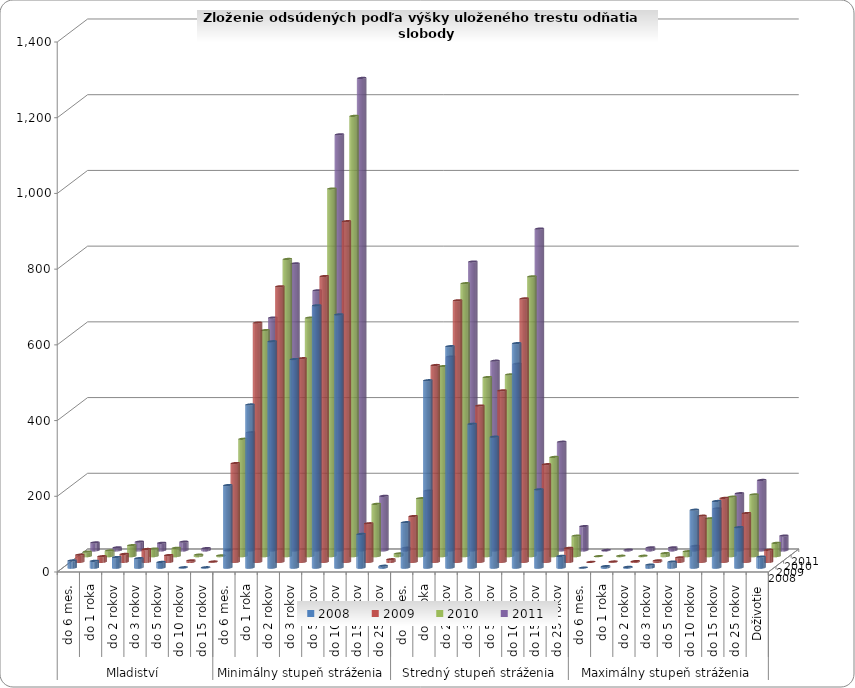
| Category | 2008 | 2009 | 2010 | 2011 |
|---|---|---|---|---|
| 0 | 19 | 19 | 12 | 21 |
| 1 | 18 | 15 | 15 | 8 |
| 2 | 28 | 21 | 29 | 23 |
| 3 | 25 | 34 | 20 | 20 |
| 4 | 15 | 18 | 22 | 23 |
| 5 | 1 | 4 | 4 | 6 |
| 6 | 1 | 1 | 2 | 1 |
| 7 | 218 | 261 | 310 | 312 |
| 8 | 431 | 632 | 597 | 615 |
| 9 | 598 | 728 | 785 | 758 |
| 10 | 551 | 538 | 630 | 687 |
| 11 | 693 | 755 | 971 | 1099 |
| 12 | 669 | 900 | 1163 | 1248 |
| 13 | 89 | 102 | 138 | 144 |
| 14 | 5 | 7 | 7 | 7 |
| 15 | 120 | 121 | 153 | 158 |
| 16 | 495 | 520 | 502 | 512 |
| 17 | 585 | 691 | 721 | 763 |
| 18 | 380 | 413 | 473 | 501 |
| 19 | 346 | 453 | 480 | 493 |
| 20 | 593 | 696 | 739 | 850 |
| 21 | 207 | 258 | 262 | 287 |
| 22 | 31 | 37 | 54 | 64 |
| 23 | 0 | 0 | 0 | 1 |
| 24 | 4 | 1 | 1 | 2 |
| 25 | 2 | 2 | 1 | 8 |
| 26 | 8 | 4 | 8 | 8 |
| 27 | 16 | 12 | 13 | 12 |
| 28 | 153 | 122 | 100 | 111 |
| 29 | 176 | 169 | 157 | 151 |
| 30 | 107 | 129 | 163 | 186 |
| 31 | 29 | 32 | 35 | 39 |